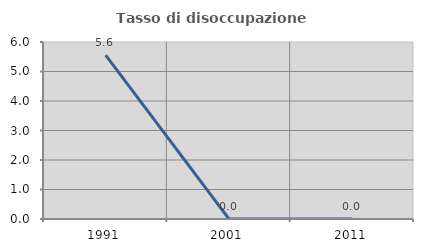
| Category | Tasso di disoccupazione giovanile  |
|---|---|
| 1991.0 | 5.556 |
| 2001.0 | 0 |
| 2011.0 | 0 |